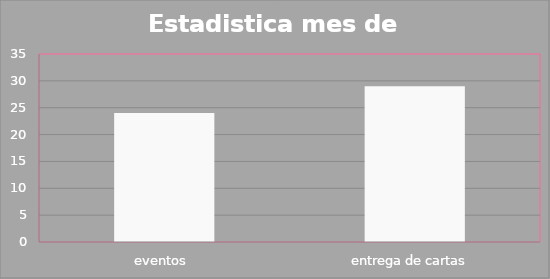
| Category | Series 0 |
|---|---|
| eventos  | 24 |
| entrega de cartas  | 29 |